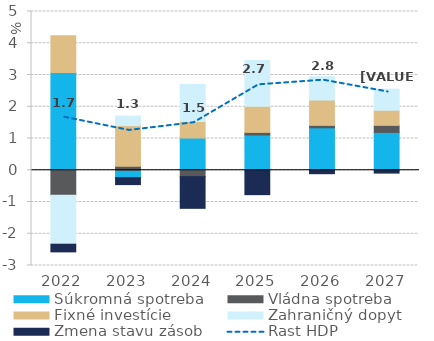
| Category | Súkromná spotreba | Vládna spotreba | Fixné investície | Zahraničný dopyt | Zmena stavu zásob |
|---|---|---|---|---|---|
| 2022.0 | 3.078 | -0.784 | 1.162 | -1.545 | -0.242 |
| 2023.0 | -0.232 | 0.127 | 1.278 | 0.301 | -0.22 |
| 2024.0 | 1.015 | -0.201 | 0.518 | 1.165 | -0.998 |
| 2025.0 | 1.11 | 0.082 | 0.825 | 1.442 | -0.769 |
| 2026.0 | 1.336 | 0.077 | 0.798 | 0.735 | -0.109 |
| 2027.0 | 1.192 | 0.222 | 0.476 | 0.666 | -0.09 |